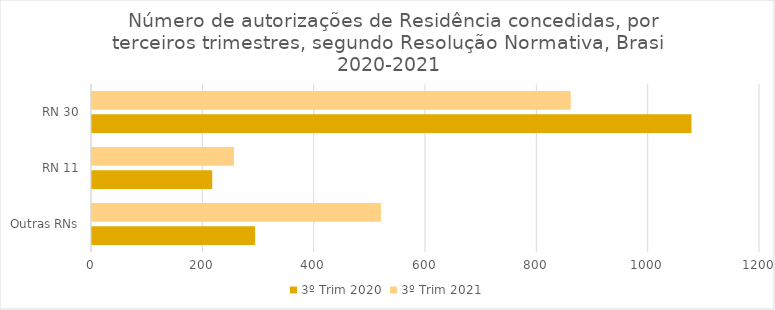
| Category | 3º Trim 2020 | 3º Trim 2021 |
|---|---|---|
| Outras RNs | 293 | 519 |
| RN 11 | 216 | 255 |
| RN 30 | 1077 | 860 |